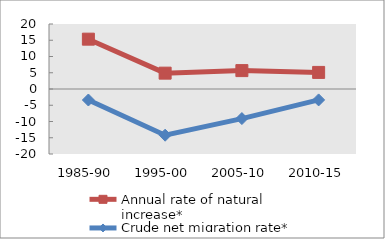
| Category | Annual rate of natural increase* | Crude net migration rate* |
|---|---|---|
| 1985-90 | 15.332 | -3.388 |
| 1995-00 | 4.876 | -14.216 |
| 2005-10 | 5.659 | -9.1 |
| 2010-15 | 5.104 | -3.36 |